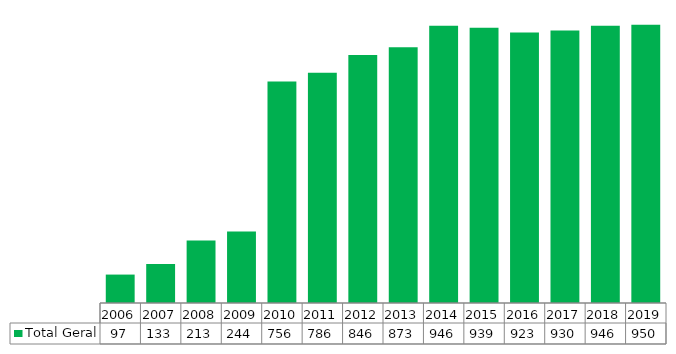
| Category | Total Geral |
|---|---|
| 2006.0 | 97 |
| 2007.0 | 133 |
| 2008.0 | 213 |
| 2009.0 | 244 |
| 2010.0 | 756 |
| 2011.0 | 786 |
| 2012.0 | 846 |
| 2013.0 | 873 |
| 2014.0 | 946 |
| 2015.0 | 939 |
| 2016.0 | 923 |
| 2017.0 | 930 |
| 2018.0 | 946 |
| 2019.0 | 950 |